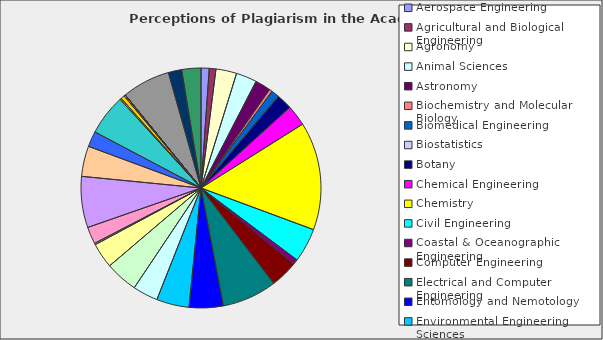
| Category | Series 0 |
|---|---|
| Aerospace Engineering | 0.011 |
| Agricultural and Biological Engineering | 0.009 |
| Agronomy | 0.028 |
| Animal Sciences | 0.028 |
| Astronomy | 0.021 |
| Biochemistry and Molecular Biology | 0.004 |
| Biomedical Engineering | 0.011 |
| Biostatistics | 0 |
| Botany | 0.021 |
| Chemical Engineering | 0.028 |
| Chemistry | 0.146 |
| Civil Engineering | 0.046 |
| Coastal & Oceanographic Engineering | 0.007 |
| Computer Engineering | 0.037 |
| Electrical and Computer Engineering | 0.074 |
| Entomology and Nemotology | 0.046 |
| Environmental Engineering Sciences | 0.044 |
| Fisheries and Aquatic Sciences | 0.034 |
| Forest Resources and Conservation | 0.044 |
| Geology | 0.034 |
| Horticultural Science | 0.002 |
| Industrial and Systems Engineering | 0.023 |
| Interdisciplinary Ecology | 0.069 |
| Materials Science and Engineering | 0.041 |
| Mathematics | 0.021 |
| Mechanical Engineering | 0.055 |
| Microbiology and Cell Science | 0.002 |
| Nuclear Engineering Sciences | 0.005 |
| Physics | 0.002 |
| Plant Molecular and Cellular Biology | 0 |
| Plant Pathology | 0 |
| Soil and Water Science | 0.065 |
| Statistics | 0.018 |
| Zoology | 0.026 |